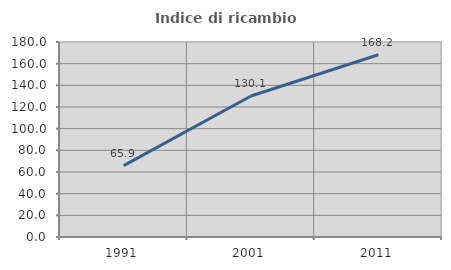
| Category | Indice di ricambio occupazionale  |
|---|---|
| 1991.0 | 65.944 |
| 2001.0 | 130.114 |
| 2011.0 | 168.235 |